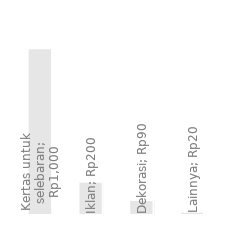
| Category | Pengeluaran Tahunan |
|---|---|
| Kertas untuk selebaran | 1000 |
| Iklan | 200 |
| Dekorasi | 90 |
| Lainnya | 20 |